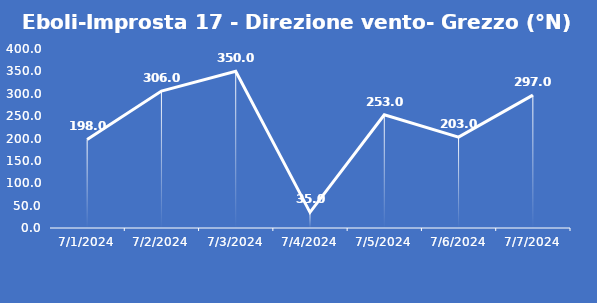
| Category | Eboli-Improsta 17 - Direzione vento- Grezzo (°N) |
|---|---|
| 7/1/24 | 198 |
| 7/2/24 | 306 |
| 7/3/24 | 350 |
| 7/4/24 | 35 |
| 7/5/24 | 253 |
| 7/6/24 | 203 |
| 7/7/24 | 297 |